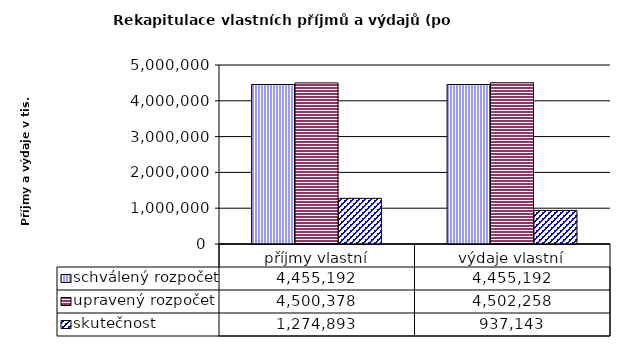
| Category | schválený rozpočet | upravený rozpočet | skutečnost |
|---|---|---|---|
| příjmy vlastní | 4455192 | 4500378 | 1274893 |
| výdaje vlastní | 4455192 | 4502258 | 937143 |